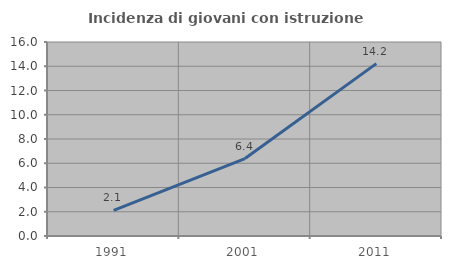
| Category | Incidenza di giovani con istruzione universitaria |
|---|---|
| 1991.0 | 2.114 |
| 2001.0 | 6.388 |
| 2011.0 | 14.216 |